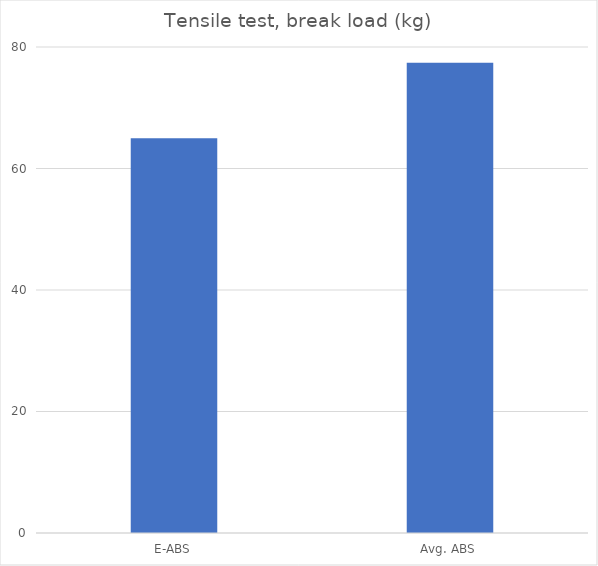
| Category | Average (kg) |
|---|---|
| E-ABS | 65 |
| Avg. ABS | 77.4 |